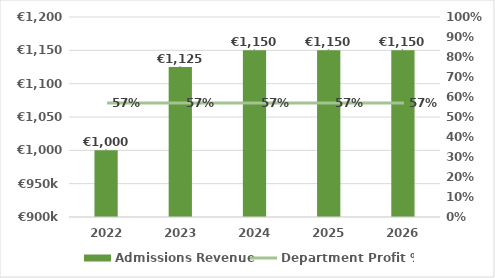
| Category | Admissions Revenue |
|---|---|
| 2022.0 | 1000000 |
| 2023.0 | 1125000 |
| 2024.0 | 1150000 |
| 2025.0 | 1150000 |
| 2026.0 | 1150000 |